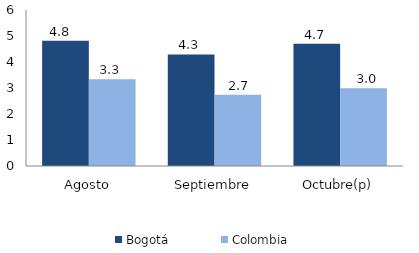
| Category | Bogotá | Colombia |
|---|---|---|
| Agosto | 4.816 | 3.335 |
| Septiembre | 4.291 | 2.739 |
| Octubre(p) | 4.705 | 2.986 |